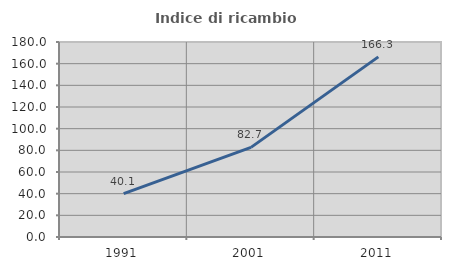
| Category | Indice di ricambio occupazionale  |
|---|---|
| 1991.0 | 40.086 |
| 2001.0 | 82.723 |
| 2011.0 | 166.286 |